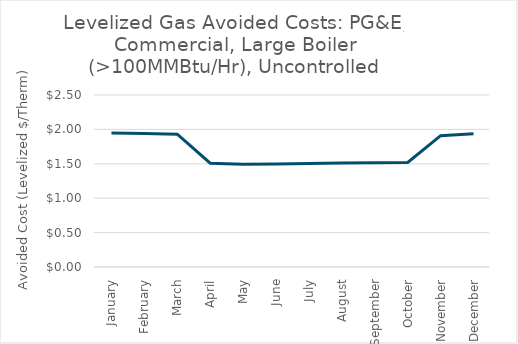
| Category | New Total |
|---|---|
| January | 1.946 |
| February | 1.94 |
| March | 1.93 |
| April | 1.508 |
| May | 1.494 |
| June | 1.497 |
| July | 1.505 |
| August | 1.511 |
| September | 1.514 |
| October | 1.52 |
| November | 1.909 |
| December | 1.938 |